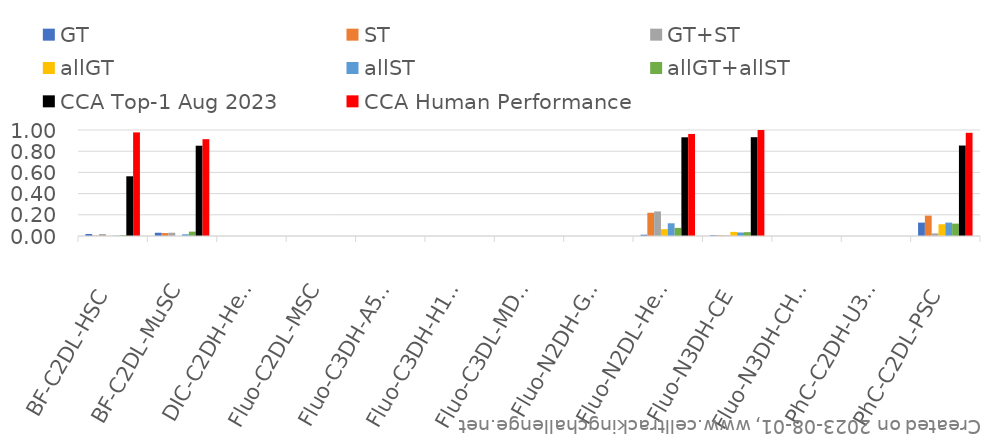
| Category | GT | ST | GT+ST | allGT | allST | allGT+allST | CCA Top-1 Aug 2023 | CCA Human Performance |
|---|---|---|---|---|---|---|---|---|
| BF-C2DL-HSC | 0.019 | 0.004 | 0.018 | 0.001 | 0.003 | 0.008 | 0.563 | 0.977 |
| BF-C2DL-MuSC | 0.031 | 0.028 | 0.031 | 0 | 0.016 | 0.041 | 0.852 | 0.913 |
| DIC-C2DH-HeLa | 0 | 0 | 0 | 0 | 0 | 0 | 0 | 0 |
| Fluo-C2DL-MSC | 0 | 0 | 0 | 0 | 0 | 0 | 0 | 0 |
| Fluo-C3DH-A549 | 0 | 0 | 0 | 0 | 0 | 0 | 0 | 0 |
| Fluo-C3DH-H157 | 0 | 0 | 0 | 0 | 0 | 0 | 0 | 0 |
| Fluo-C3DL-MDA231 | 0 | 0 | 0 | 0 | 0 | 0 | 0 | 0 |
| Fluo-N2DH-GOWT1 | 0 | 0 | 0 | 0 | 0 | 0 | 0 | 0 |
| Fluo-N2DL-HeLa | 0.012 | 0.219 | 0.232 | 0.065 | 0.12 | 0.077 | 0.931 | 0.963 |
| Fluo-N3DH-CE | 0.007 | 0.006 | 0.006 | 0.039 | 0.033 | 0.036 | 0.932 | 1 |
| Fluo-N3DH-CHO | 0 | 0 | 0 | 0 | 0 | 0 | 0 | 0 |
| PhC-C2DH-U373 | 0 | 0 | 0 | 0 | 0 | 0 | 0 | 0 |
| PhC-C2DL-PSC | 0.126 | 0.192 | 0.025 | 0.111 | 0.126 | 0.117 | 0.853 | 0.974 |